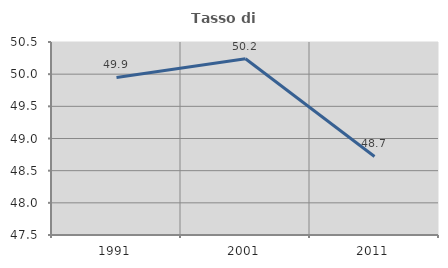
| Category | Tasso di occupazione   |
|---|---|
| 1991.0 | 49.948 |
| 2001.0 | 50.24 |
| 2011.0 | 48.721 |